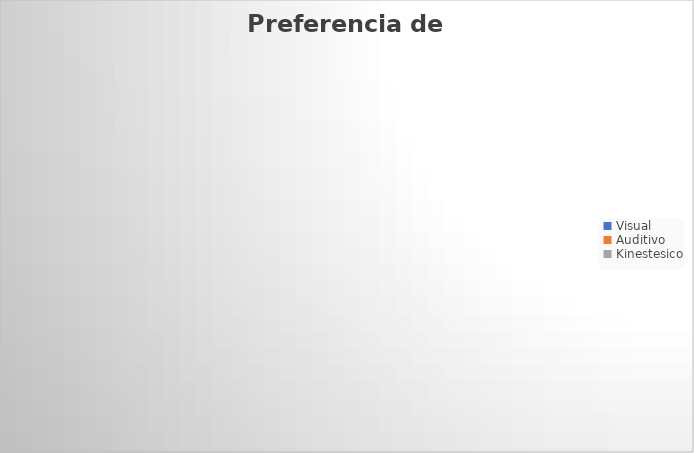
| Category | Series 0 |
|---|---|
| Visual | 0 |
| Auditivo | 0 |
| Kinestesico | 0 |